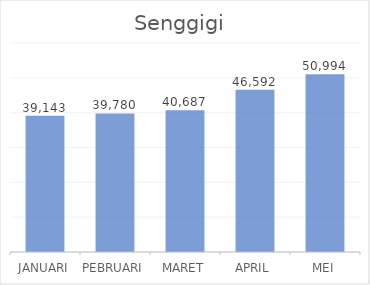
| Category |  39,143  |
|---|---|
| JANUARI | 39143 |
| PEBRUARI | 39780 |
| MARET | 40687 |
| APRIL | 46592 |
| MEI | 50994 |